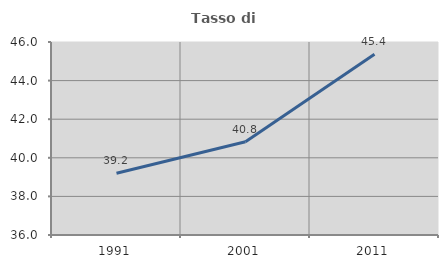
| Category | Tasso di occupazione   |
|---|---|
| 1991.0 | 39.199 |
| 2001.0 | 40.835 |
| 2011.0 | 45.37 |